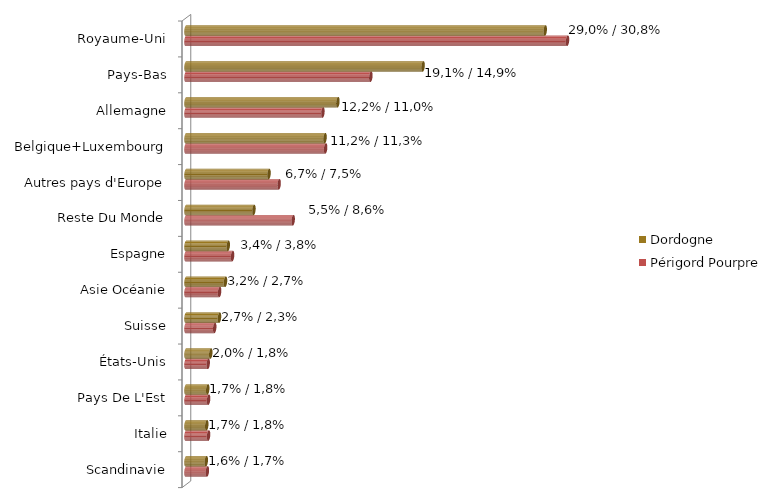
| Category | Périgord Pourpre | Dordogne |
|---|---|---|
| Scandinavie | 0.017 | 0.016 |
| Italie | 0.018 | 0.017 |
| Pays De L'Est | 0.018 | 0.018 |
| États-Unis | 0.018 | 0.02 |
| Suisse | 0.023 | 0.027 |
| Asie Océanie | 0.027 | 0.032 |
| Espagne | 0.038 | 0.034 |
| Reste Du Monde | 0.086 | 0.055 |
| Autres pays d'Europe | 0.075 | 0.067 |
| Belgique+Luxembourg | 0.113 | 0.112 |
| Allemagne | 0.11 | 0.122 |
| Pays-Bas | 0.149 | 0.191 |
| Royaume-Uni | 0.308 | 0.29 |